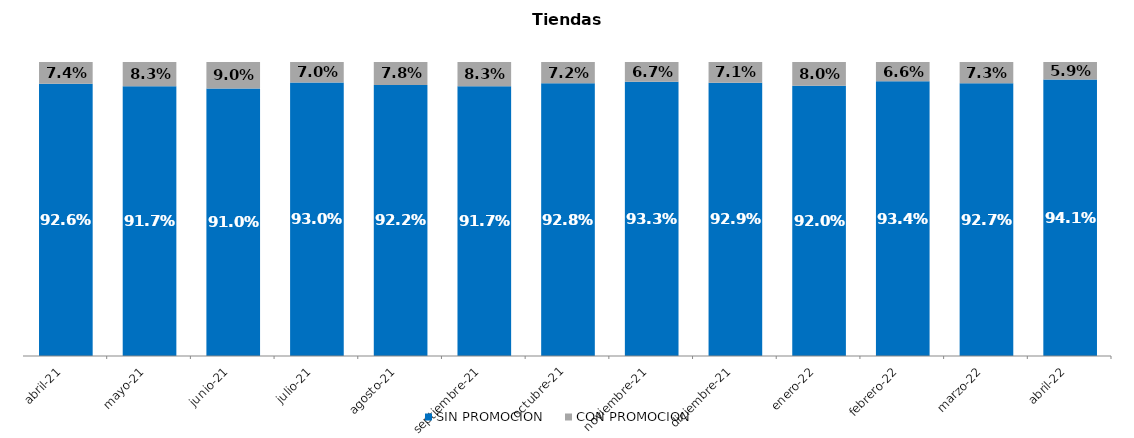
| Category | SIN PROMOCION   | CON PROMOCION   |
|---|---|---|
| 2021-04-01 | 0.926 | 0.074 |
| 2021-05-01 | 0.917 | 0.083 |
| 2021-06-01 | 0.91 | 0.09 |
| 2021-07-01 | 0.93 | 0.07 |
| 2021-08-01 | 0.922 | 0.078 |
| 2021-09-01 | 0.917 | 0.083 |
| 2021-10-01 | 0.928 | 0.072 |
| 2021-11-01 | 0.933 | 0.067 |
| 2021-12-01 | 0.929 | 0.071 |
| 2022-01-01 | 0.92 | 0.08 |
| 2022-02-01 | 0.934 | 0.066 |
| 2022-03-01 | 0.927 | 0.073 |
| 2022-04-01 | 0.941 | 0.059 |